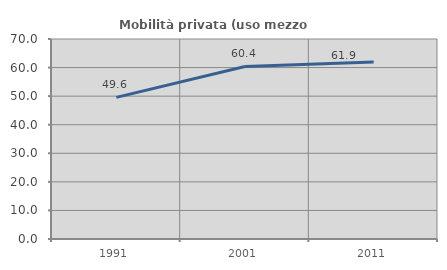
| Category | Mobilità privata (uso mezzo privato) |
|---|---|
| 1991.0 | 49.582 |
| 2001.0 | 60.38 |
| 2011.0 | 61.95 |